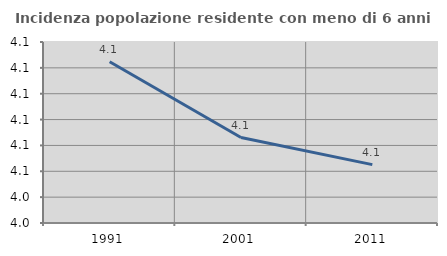
| Category | Incidenza popolazione residente con meno di 6 anni |
|---|---|
| 1991.0 | 4.092 |
| 2001.0 | 4.063 |
| 2011.0 | 4.053 |